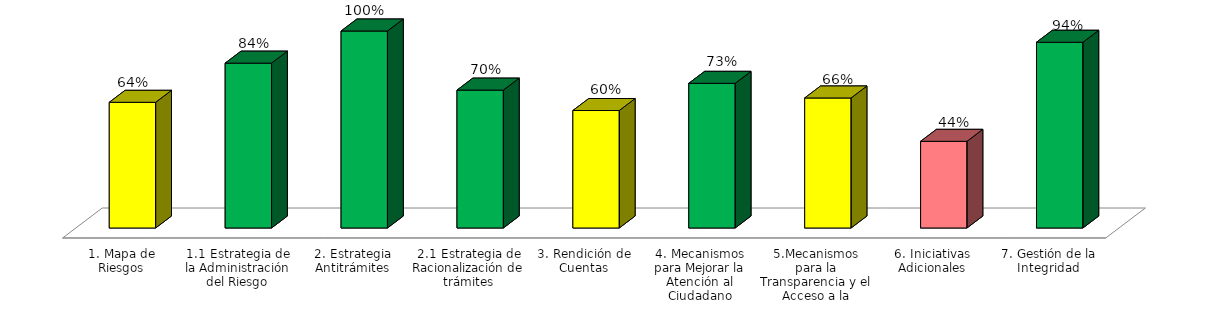
| Category | Series 0 |
|---|---|
| 1. Mapa de Riesgos | 0.638 |
| 1.1 Estrategia de la Administración del Riesgo | 0.837 |
| 2. Estrategia Antitrámites | 1 |
| 2.1 Estrategia de Racionalización de trámites | 0.7 |
| 3. Rendición de Cuentas | 0.596 |
| 4. Mecanismos para Mejorar la Atención al Ciudadano | 0.734 |
| 5.Mecanismos para la Transparencia y el Acceso a la Información | 0.66 |
| 6. Iniciativas Adicionales | 0.44 |
| 7. Gestión de la Integridad | 0.943 |